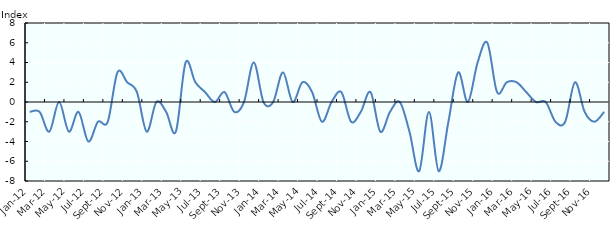
| Category | Series 0 |
|---|---|
| Jan-12 | -1 |
| Feb-12 | -1 |
| Mar-12 | -3 |
| Apr-12 | 0 |
| May-12 | -3 |
| Jun-12 | -1 |
| Jul-12 | -4 |
| Aug-12 | -2 |
| Sep-12 | -2 |
| Oct-12 | 3 |
| Nov-12 | 2 |
| Dec-12 | 1 |
| Jan-13 | -3 |
| Feb-13 | 0 |
| Mar-13 | -1 |
| Apr-13 | -3 |
| May-13 | 4 |
| Jun-13 | 2 |
| Jul-13 | 1 |
| Aug-13 | 0 |
| Sep-13 | 1 |
| Oct-13 | -1 |
| Nov-13 | 0 |
| Dec-13 | 4 |
| Jan-14 | 0 |
| Feb-14 | 0 |
| Mar-14 | 3 |
| Apr-14 | 0 |
| May-14 | 2 |
| Jun-14 | 1 |
| Jul-14 | -2 |
| Aug-14 | 0 |
| Sep-14 | 1 |
| Oct-14 | -2 |
| Nov-14 | -1 |
| Dec-14 | 1 |
| Jan-15 | -3 |
| Feb-15 | -1 |
| Mar-15 | 0 |
| Apr-15 | -3 |
| May-15 | -7 |
| Jun-15 | -1 |
| Jul-15 | -7 |
| Aug-15 | -2 |
| Sep-15 | 3 |
| Oct-15 | 0 |
| Nov-15 | 4 |
| Dec-15 | 6 |
| Jan-16 | 1 |
| Feb-16 | 2 |
| Mar-16 | 2 |
| Apr-16 | 1 |
| May-16 | 0 |
| Jun-16 | 0 |
| Jul-16 | -2 |
| Aug-16 | -2 |
| Sep-16 | 2 |
| Oct-16 | -1 |
| Nov-16 | -2 |
| Dec-16 | -1 |